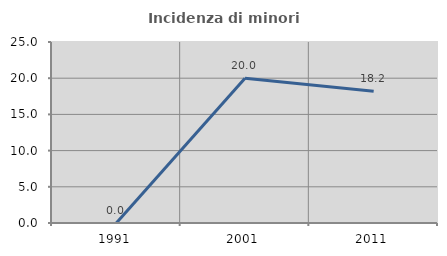
| Category | Incidenza di minori stranieri |
|---|---|
| 1991.0 | 0 |
| 2001.0 | 20 |
| 2011.0 | 18.182 |